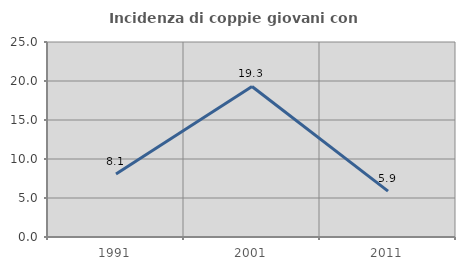
| Category | Incidenza di coppie giovani con figli |
|---|---|
| 1991.0 | 8.065 |
| 2001.0 | 19.298 |
| 2011.0 | 5.882 |